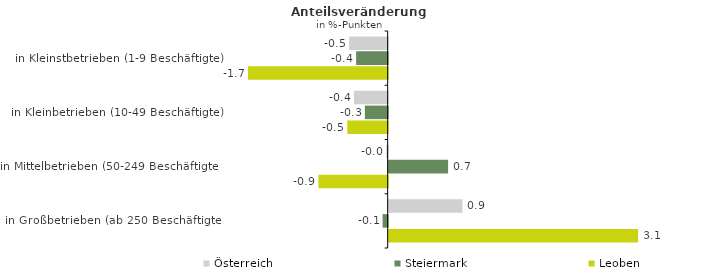
| Category | Österreich | Steiermark | Leoben |
|---|---|---|---|
| in Kleinstbetrieben (1-9 Beschäftigte) | -0.48 | -0.393 | -1.739 |
| in Kleinbetrieben (10-49 Beschäftigte) | -0.42 | -0.284 | -0.503 |
| in Mittelbetrieben (50-249 Beschäftigte) | -0.019 | 0.74 | -0.862 |
| in Großbetrieben (ab 250 Beschäftigte) | 0.919 | -0.063 | 3.104 |